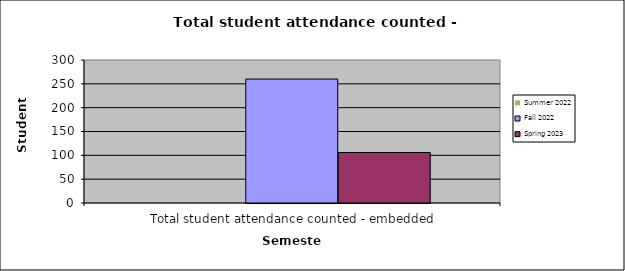
| Category | Summer 2022 | Fall 2022 | Spring 2023 |
|---|---|---|---|
| 0 | 0 | 260 | 106 |